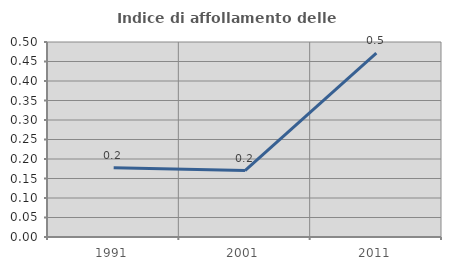
| Category | Indice di affollamento delle abitazioni  |
|---|---|
| 1991.0 | 0.178 |
| 2001.0 | 0.17 |
| 2011.0 | 0.472 |